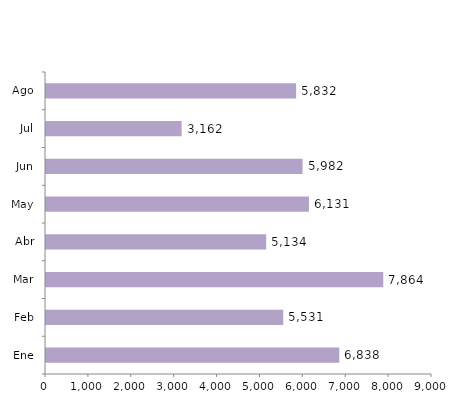
| Category | Series 0 |
|---|---|
| Ene | 6838 |
| Feb | 5531 |
| Mar | 7864 |
| Abr | 5134 |
| May | 6131 |
| Jun | 5982 |
| Jul | 3162 |
| Ago | 5832 |